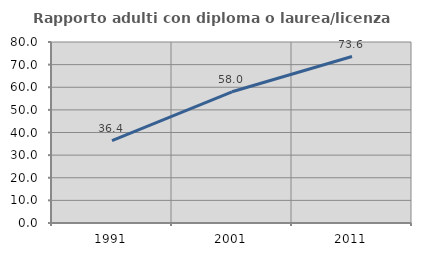
| Category | Rapporto adulti con diploma o laurea/licenza media  |
|---|---|
| 1991.0 | 36.364 |
| 2001.0 | 58 |
| 2011.0 | 73.585 |